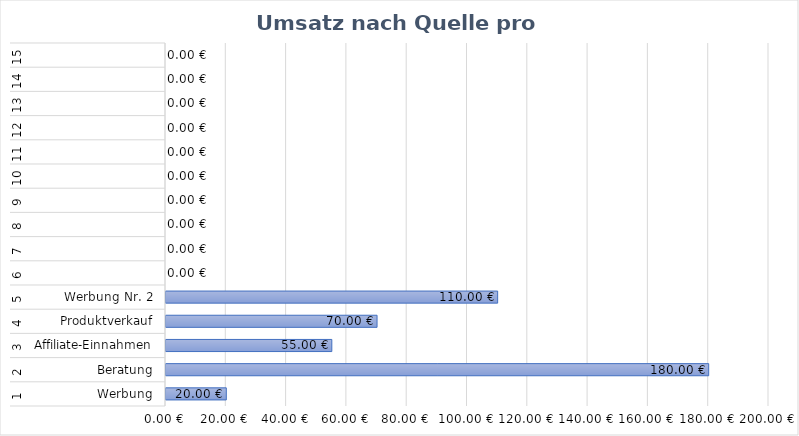
| Category | Series 0 |
|---|---|
| 0 | 20 |
| 1 | 180 |
| 2 | 55 |
| 3 | 70 |
| 4 | 110 |
| 5 | 0 |
| 6 | 0 |
| 7 | 0 |
| 8 | 0 |
| 9 | 0 |
| 10 | 0 |
| 11 | 0 |
| 12 | 0 |
| 13 | 0 |
| 14 | 0 |